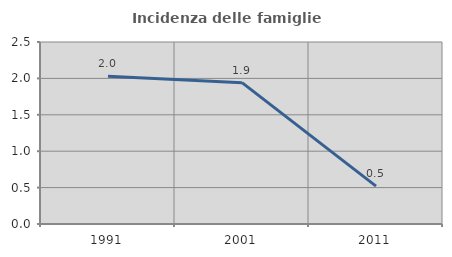
| Category | Incidenza delle famiglie numerose |
|---|---|
| 1991.0 | 2.03 |
| 2001.0 | 1.942 |
| 2011.0 | 0.521 |